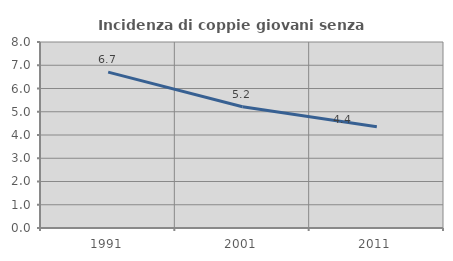
| Category | Incidenza di coppie giovani senza figli |
|---|---|
| 1991.0 | 6.706 |
| 2001.0 | 5.215 |
| 2011.0 | 4.358 |